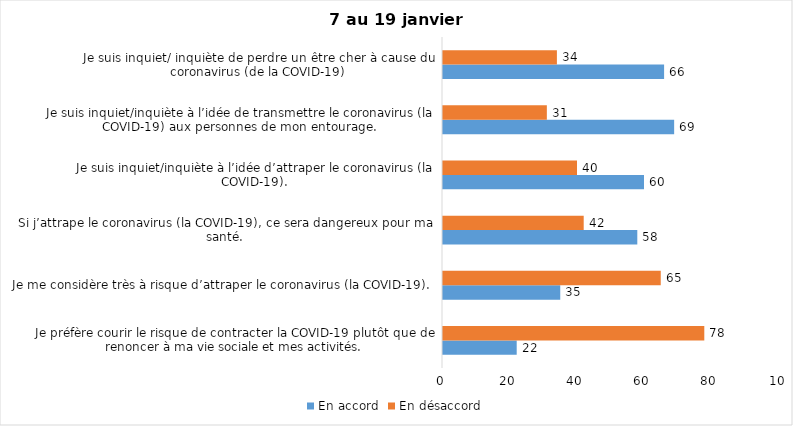
| Category | En accord | En désaccord |
|---|---|---|
| Je préfère courir le risque de contracter la COVID-19 plutôt que de renoncer à ma vie sociale et mes activités. | 22 | 78 |
| Je me considère très à risque d’attraper le coronavirus (la COVID-19). | 35 | 65 |
| Si j’attrape le coronavirus (la COVID-19), ce sera dangereux pour ma santé. | 58 | 42 |
| Je suis inquiet/inquiète à l’idée d’attraper le coronavirus (la COVID-19). | 60 | 40 |
| Je suis inquiet/inquiète à l’idée de transmettre le coronavirus (la COVID-19) aux personnes de mon entourage. | 69 | 31 |
| Je suis inquiet/ inquiète de perdre un être cher à cause du coronavirus (de la COVID-19) | 66 | 34 |